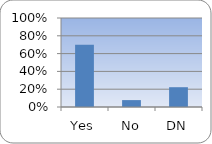
| Category | Series 0 |
|---|---|
| Yes | 0.7 |
| No | 0.078 |
| DN | 0.222 |